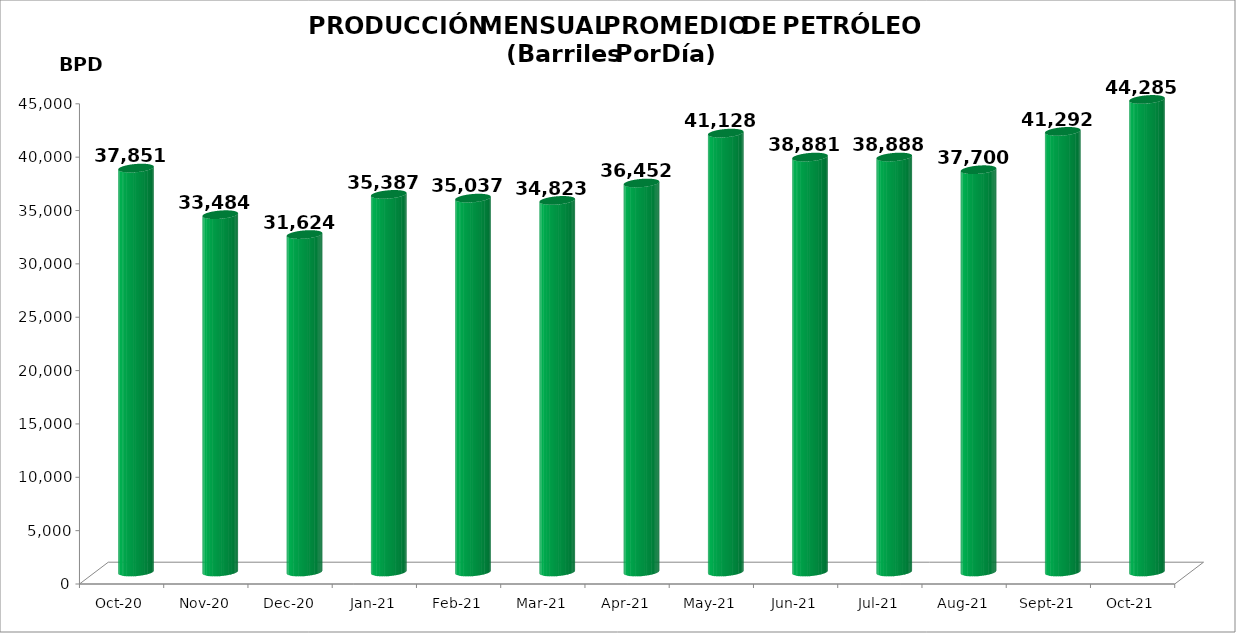
| Category | Series 0 |
|---|---|
| 2020-10-01 | 37851 |
| 2020-11-01 | 33484 |
| 2020-12-01 | 31624 |
| 2021-01-01 | 35387 |
| 2021-02-01 | 35037 |
| 2021-03-01 | 34823 |
| 2021-04-01 | 36452 |
| 2021-05-01 | 41128.032 |
| 2021-06-01 | 38881.4 |
| 2021-07-01 | 38887.645 |
| 2021-08-01 | 37699.645 |
| 2021-09-01 | 41292 |
| 2021-10-01 | 44285 |